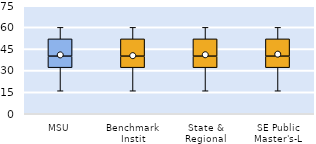
| Category | 25th | 50th | 75th |
|---|---|---|---|
| MSU | 32 | 8 | 12 |
| Benchmark Instit | 32 | 8 | 12 |
| State & Regional | 32 | 8 | 12 |
| SE Public Master's-L | 32 | 8 | 12 |